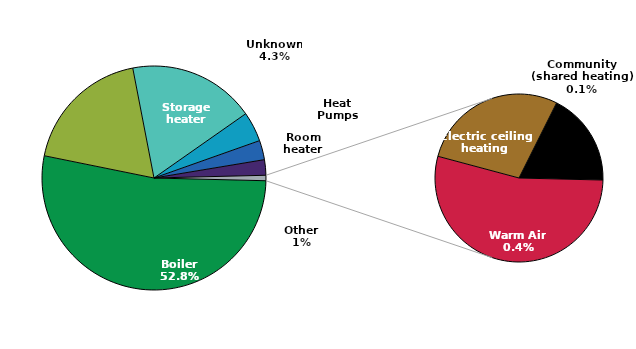
| Category | Number replaced |
|---|---|
| Boiler | 58215 |
| First heating system | 20703 |
| Storage heater | 20190 |
| Unknown | 4757 |
| Room heater | 3075 |
| Heat Pumps | 2464 |
| Warm Air | 463 |
| Electric ceiling heating | 243 |
| Community (shared heating) | 155 |